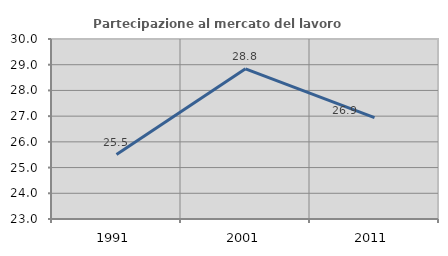
| Category | Partecipazione al mercato del lavoro  femminile |
|---|---|
| 1991.0 | 25.507 |
| 2001.0 | 28.842 |
| 2011.0 | 26.943 |